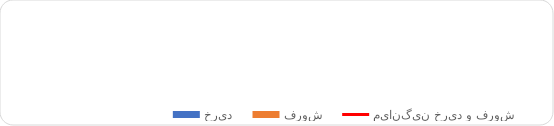
| Category | خرید | فروش |
|---|---|---|
| فروردین | 0 | 0 |
| اردیبهشت | 0 | 0 |
| خرداد | 9123168000 | 0 |
| تیر | 8325711270 | 8386524000 |
| مرداد | 0 | 0 |
| شهریور | 175493904000 | 0 |
| مهر | 834674370870 | 499808191900 |
| آبان | 159337072000 | 454538941110 |
| آذر | 0 | 456761791280 |
| دی | 0 | 0 |
| بهمن | 0 | 0 |
| اسفند | 0 | 0 |